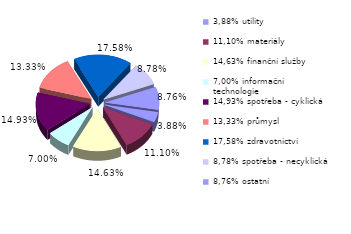
| Category | Series 0 |
|---|---|
| 3,88% utility | 0.039 |
| 11,10% materiály | 0.111 |
| 14,63% finanční služby | 0.146 |
| 7,00% informační technologie | 0.07 |
| 14,93% spotřeba - cyklická | 0.149 |
| 13,33% průmysl | 0.133 |
| 17,58% zdravotnictví | 0.176 |
| 8,78% spotřeba - necyklická | 0.088 |
| 8,76% ostatní | 0.088 |